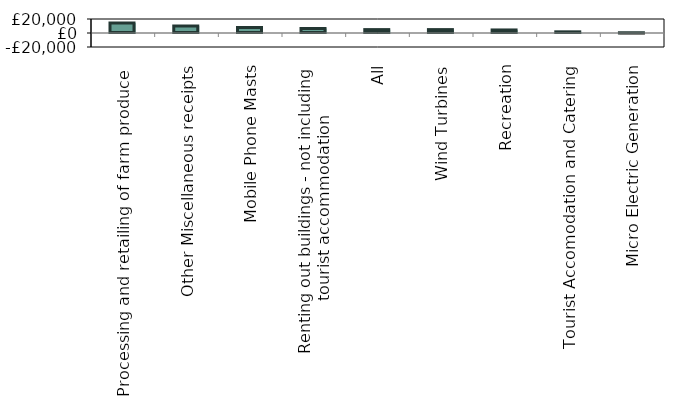
| Category | Series 0 |
|---|---|
| Processing and retailing of farm produce  | 14180 |
| Other Miscellaneous receipts | 10045 |
| Mobile Phone Masts | 7977 |
| Renting out buildings - not including
tourist accommodation | 6401 |
| All | 4854 |
| Wind Turbines | 4849 |
| Recreation | 4353 |
| Tourist Accomodation and Catering | 1656 |
| Micro Electric Generation | -367 |